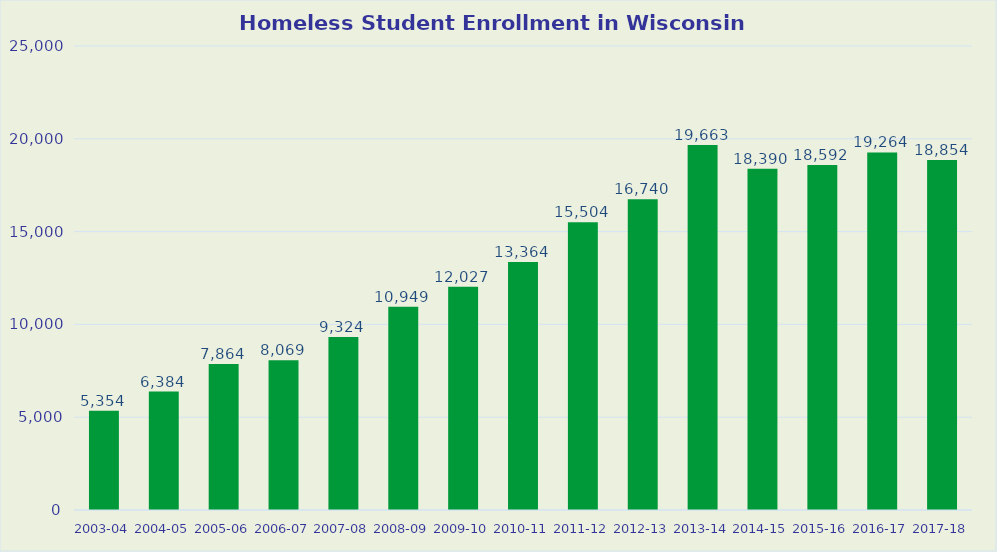
| Category | Series 0 |
|---|---|
| 2003-04 | 5354 |
| 2004-05 | 6384 |
| 2005-06 | 7864 |
| 2006-07 | 8069 |
| 2007-08 | 9324 |
| 2008-09 | 10949 |
| 2009-10 | 12027 |
| 2010-11 | 13364 |
| 2011-12 | 15504 |
| 2012-13 | 16740 |
| 2013-14 | 19663 |
| 2014-15 | 18390 |
| 2015-16 | 18592 |
| 2016-17 | 19264 |
| 2017-18 | 18854 |